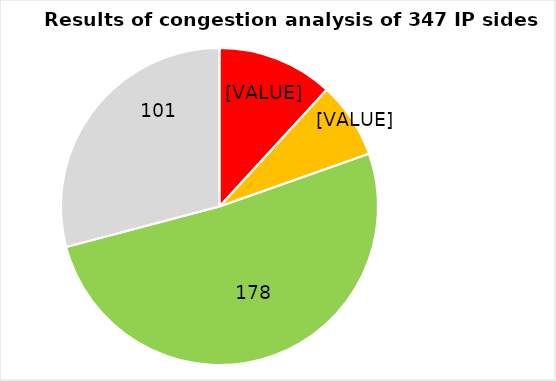
| Category | Series 0 |
|---|---|
| congested | 41 |
| close to be congested (23 due to quota) | 27 |
| non-congested | 178 |
| out of scope (mainly VR) | 101 |